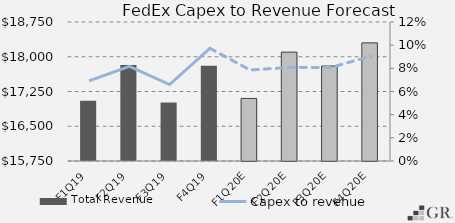
| Category | Total Revenue |
|---|---|
|  F1Q19  | 17052 |
|  F2Q19  | 17824 |
|  F3Q19  | 17010 |
|  F4Q19  | 17807 |
|  F1Q20E  | 17100 |
|  F2Q20E  | 18100 |
|  F3Q20E  | 17800 |
|  F4Q20E  | 18300 |